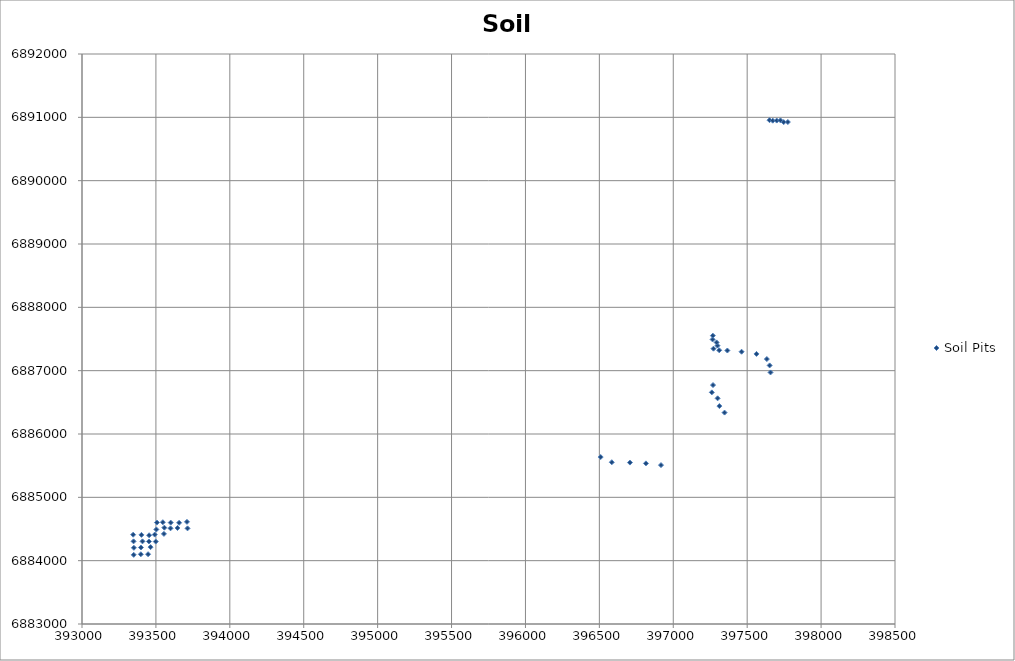
| Category | Soil Pits |
|---|---|
| 397366.0 | 6887318 |
| 397311.0 | 6887322 |
| 397272.0 | 6887347 |
| 397299.0 | 6887395 |
| 397293.0 | 6887446 |
| 397266.0 | 6887493 |
| 397268.0 | 6887553 |
| 397462.0 | 6887299 |
| 397563.0 | 6887264 |
| 397633.0 | 6887183 |
| 397652.0 | 6887083 |
| 397658.0 | 6886972 |
| 397269.0 | 6886773 |
| 397261.0 | 6886657 |
| 397300.0 | 6886563 |
| 397312.0 | 6886441 |
| 397347.0 | 6886338 |
| 393350.0 | 6884092 |
| 393398.0 | 6884101 |
| 393447.0 | 6884102 |
| 393351.0 | 6884203 |
| 393399.0 | 6884208 |
| 393464.0 | 6884214 |
| 393349.0 | 6884305 |
| 393409.0 | 6884305 |
| 393453.0 | 6884303 |
| 393499.0 | 6884302 |
| 396917.0 | 6885509 |
| 396815.0 | 6885536 |
| 396707.0 | 6885549 |
| 396584.0 | 6885554 |
| 396509.0 | 6885636 |
| 393346.0 | 6884410 |
| 393402.0 | 6884407 |
| 393454.0 | 6884401 |
| 393492.0 | 6884412 |
| 393554.0 | 6884423 |
| 393557.0 | 6884521 |
| 393599.0 | 6884511 |
| 393646.0 | 6884516 |
| 393714.0 | 6884510 |
| 393503.0 | 6884493 |
| 393507.0 | 6884602 |
| 393547.0 | 6884607 |
| 393600.0 | 6884601 |
| 393657.0 | 6884598 |
| 393710.0 | 6884613 |
| 397651.0 | 6890955 |
| 397673.0 | 6890947 |
| 397700.0 | 6890949 |
| 397725.0 | 6890952 |
| 397747.0 | 6890925 |
| 397775.0 | 6890926 |